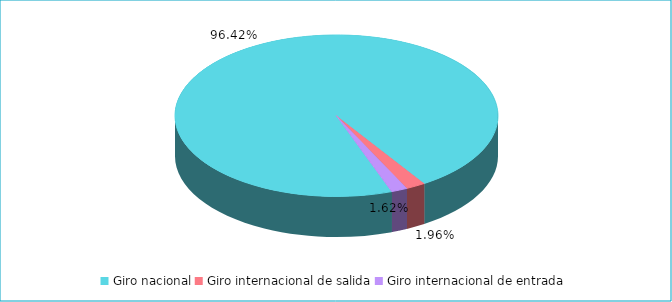
| Category | Series 0 |
|---|---|
| Giro nacional | 0.964 |
| Giro internacional de salida | 0.02 |
| Giro internacional de entrada | 0.016 |